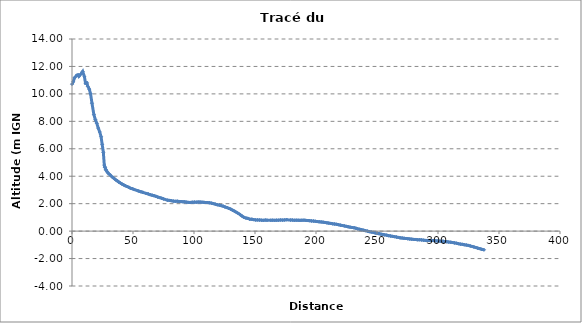
| Category | Series 0 |
|---|---|
| 0.0 | 10.713 |
| 0.9823695840209037 | 10.881 |
| 2.1064655231889176 | 11.178 |
| 3.883624209706859 | 11.355 |
| 4.971251854803458 | 11.383 |
| 5.593375099369395 | 11.276 |
| 7.583648264639291 | 11.479 |
| 8.784838074986817 | 11.636 |
| 10.213469733987893 | 11.242 |
| 11.094925686850335 | 10.779 |
| 12.198148875799431 | 10.802 |
| 12.964042039138073 | 10.547 |
| 14.170417389553853 | 10.342 |
| 15.20560455894221 | 10.012 |
| 16.384305173126187 | 9.319 |
| 17.94358004990838 | 8.488 |
| 19.141554378161295 | 8.122 |
| 20.333660688939688 | 7.86 |
| 21.503285447102375 | 7.508 |
| 22.71505150819449 | 7.226 |
| 23.83727878756313 | 6.879 |
| 24.733715046967685 | 6.324 |
| 25.681266986200274 | 5.744 |
| 26.482229607711126 | 4.813 |
| 26.957844016485954 | 4.664 |
| 27.054082298662514 | 4.653 |
| 27.697127450605613 | 4.495 |
| 27.96951261656911 | 4.438 |
| 28.672098806946412 | 4.333 |
| 29.81749503247473 | 4.211 |
| 31.00277189211757 | 4.114 |
| 33.301046469910474 | 3.919 |
| 34.58173196975617 | 3.833 |
| 35.84707876522838 | 3.733 |
| 37.1386459233789 | 3.666 |
| 38.41183153662945 | 3.569 |
| 39.71576947535036 | 3.5 |
| 40.98992048071477 | 3.432 |
| 42.35818099280587 | 3.367 |
| 43.72840844339537 | 3.304 |
| 45.13561097402024 | 3.251 |
| 46.5750574452306 | 3.19 |
| 48.01179331218536 | 3.12 |
| 49.61904837890982 | 3.086 |
| 51.07265712738125 | 3.03 |
| 53.86975460291575 | 2.948 |
| 55.14297058599124 | 2.899 |
| 56.55087918907052 | 2.866 |
| 57.987274060557496 | 2.829 |
| 60.97394973311897 | 2.743 |
| 62.50894666379638 | 2.705 |
| 64.08539780618398 | 2.655 |
| 65.63450574956144 | 2.617 |
| 67.22227418077676 | 2.58 |
| 68.75191555147632 | 2.535 |
| 70.27330014294945 | 2.484 |
| 71.92268310542718 | 2.442 |
| 73.42339672089955 | 2.396 |
| 74.99751710547497 | 2.346 |
| 78.17573024963872 | 2.255 |
| 79.75999379397163 | 2.239 |
| 81.35522973344919 | 2.217 |
| 83.0022109169089 | 2.188 |
| 84.65358605502666 | 2.172 |
| 86.26159597970131 | 2.177 |
| 87.82574046958935 | 2.16 |
| 89.38672667133189 | 2.152 |
| 90.97394107084693 | 2.14 |
| 92.48192243924275 | 2.133 |
| 94.01971985222264 | 2.107 |
| 95.50650902422107 | 2.094 |
| 97.02152949194632 | 2.09 |
| 98.65912581243192 | 2.105 |
| 100.23383441780689 | 2.113 |
| 101.8217134263313 | 2.109 |
| 103.35691739338183 | 2.115 |
| 104.95852623355857 | 2.115 |
| 106.52854877978965 | 2.109 |
| 108.11879249233674 | 2.096 |
| 111.19988735598524 | 2.08 |
| 112.77116515305373 | 2.064 |
| 114.41395245381217 | 2.035 |
| 116.0138230126916 | 2.002 |
| 117.46746900316523 | 1.963 |
| 119.08056301516336 | 1.921 |
| 120.72345662769219 | 1.894 |
| 122.3244862198023 | 1.855 |
| 123.87987579119545 | 1.818 |
| 125.41709097297375 | 1.759 |
| 126.94618782038084 | 1.717 |
| 128.4854778567713 | 1.659 |
| 130.0828422281631 | 1.605 |
| 131.62816496884093 | 1.523 |
| 133.19169536433904 | 1.453 |
| 134.8128526852797 | 1.368 |
| 136.41132880051197 | 1.284 |
| 137.9990860332697 | 1.189 |
| 139.5111612168083 | 1.086 |
| 141.03278081400433 | 0.998 |
| 142.63962095086168 | 0.952 |
| 144.2007579904216 | 0.926 |
| 145.74329281279728 | 0.867 |
| 147.37613796380717 | 0.866 |
| 148.94868891382518 | 0.835 |
| 150.51607091964783 | 0.815 |
| 152.07281551343928 | 0.818 |
| 153.66284028691922 | 0.807 |
| 155.2096010206736 | 0.799 |
| 156.78133297698704 | 0.786 |
| 158.38252771370682 | 0.804 |
| 159.85486862756036 | 0.797 |
| 162.9884027198217 | 0.791 |
| 164.51125189510003 | 0.796 |
| 166.16779274273978 | 0.785 |
| 167.76734240311504 | 0.799 |
| 169.4061022784697 | 0.797 |
| 171.0325391555442 | 0.808 |
| 172.6921126688675 | 0.799 |
| 174.30848138284907 | 0.814 |
| 176.02841449068475 | 0.828 |
| 179.1301946884541 | 0.802 |
| 180.6285884125433 | 0.803 |
| 182.19388372035496 | 0.792 |
| 183.76598218966944 | 0.798 |
| 185.35803253707977 | 0.794 |
| 186.87590411011743 | 0.782 |
| 188.48412408983413 | 0.792 |
| 190.1392187324958 | 0.799 |
| 191.72736244198344 | 0.782 |
| 193.2707054936123 | 0.771 |
| 194.72092611965098 | 0.76 |
| 196.31926448754706 | 0.74 |
| 197.9444443906459 | 0.733 |
| 199.47895839159872 | 0.715 |
| 201.01445793086285 | 0.698 |
| 202.57790258815183 | 0.679 |
| 204.22123049338143 | 0.668 |
| 205.83238354555584 | 0.651 |
| 207.42497103316262 | 0.629 |
| 208.969305636079 | 0.604 |
| 210.52553911110934 | 0.582 |
| 212.09616344523357 | 0.56 |
| 213.66644420679918 | 0.533 |
| 215.25559268927665 | 0.517 |
| 216.87792015348882 | 0.496 |
| 218.44042099668076 | 0.466 |
| 219.98815928345178 | 0.434 |
| 221.5754323570697 | 0.409 |
| 223.18418682826106 | 0.379 |
| 224.80100572075952 | 0.348 |
| 226.33669521365334 | 0.317 |
| 227.91020408918988 | 0.289 |
| 229.49300732899985 | 0.263 |
| 231.17218830396558 | 0.245 |
| 232.75438881374401 | 0.209 |
| 234.21623327373317 | 0.165 |
| 235.79844529854125 | 0.134 |
| 237.38771317855264 | 0.106 |
| 238.9604208233807 | 0.065 |
| 240.5140941176181 | 0.033 |
| 242.1504101031993 | -0.002 |
| 243.75543908036107 | -0.039 |
| 245.28484574692763 | -0.066 |
| 246.92144700141213 | -0.095 |
| 248.560002739635 | -0.135 |
| 250.15067348326335 | -0.16 |
| 251.7093223563862 | -0.188 |
| 253.27722197867334 | -0.221 |
| 254.84437472760808 | -0.244 |
| 256.37123980095896 | -0.275 |
| 257.97327913736416 | -0.297 |
| 259.5541590109536 | -0.333 |
| 261.10405623096574 | -0.356 |
| 262.646995646612 | -0.381 |
| 264.34901569360153 | -0.405 |
| 265.9902309489055 | -0.433 |
| 267.487878218543 | -0.46 |
| 268.95723500394683 | -0.49 |
| 270.5490480952739 | -0.503 |
| 272.13169503995516 | -0.523 |
| 273.75058921614675 | -0.537 |
| 275.31889816912104 | -0.554 |
| 276.8836349696233 | -0.573 |
| 278.5046419006766 | -0.588 |
| 280.0630544435646 | -0.606 |
| 281.64886204255475 | -0.609 |
| 283.1451182221812 | -0.63 |
| 284.8003744173374 | -0.631 |
| 286.452620759981 | -0.641 |
| 288.03885742386313 | -0.66 |
| 289.62537122459383 | -0.678 |
| 291.21525325802713 | -0.678 |
| 292.8306164662394 | -0.677 |
| 294.4458083129246 | -0.686 |
| 296.06621585242095 | -0.689 |
| 297.64332905224205 | -0.704 |
| 299.2673911171116 | -0.713 |
| 300.80959571286667 | -0.728 |
| 302.3849499236674 | -0.736 |
| 304.05542215835743 | -0.737 |
| 305.61622434234965 | -0.762 |
| 307.2628601865403 | -0.774 |
| 308.8184613993281 | -0.798 |
| 310.418325995833 | -0.81 |
| 312.00362000438435 | -0.833 |
| 313.56083426644363 | -0.86 |
| 315.15700981149223 | -0.883 |
| 316.7982336143933 | -0.919 |
| 318.3963541330672 | -0.95 |
| 319.9780089087754 | -0.965 |
| 321.55553985284627 | -0.993 |
| 323.1678237702216 | -1.014 |
| 324.77029717925 | -1.041 |
| 326.4649032926664 | -1.084 |
| 328.1575777417406 | -1.12 |
| 329.491220655757 | -1.157 |
| 331.06878959542195 | -1.198 |
| 332.576545477827 | -1.242 |
| 334.1447371204717 | -1.275 |
| 335.59922203773255 | -1.322 |
| 337.70672570928883 | -1.361 |